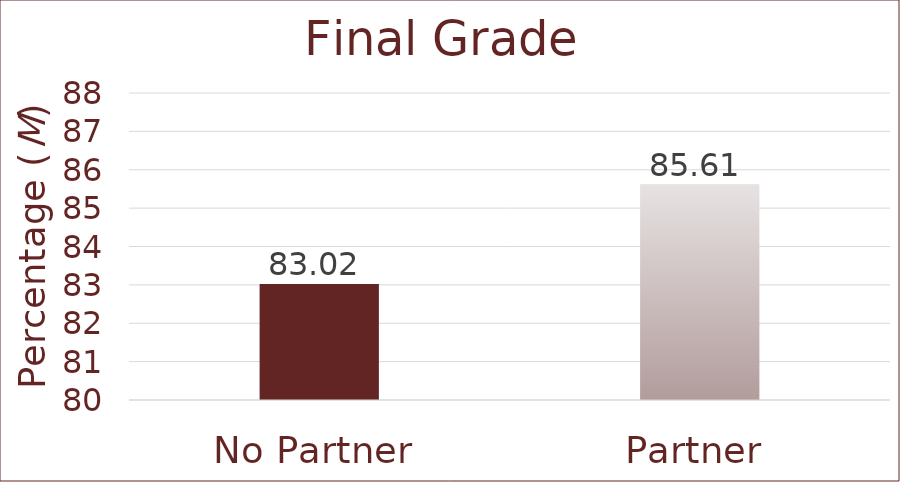
| Category | Final Grade |
|---|---|
| No Partner | 83.02 |
| Partner | 85.61 |